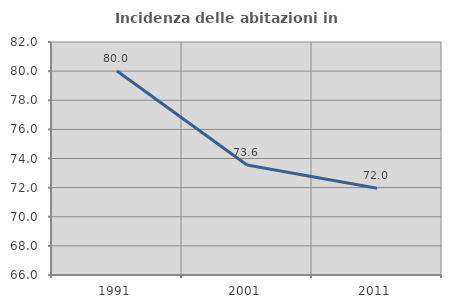
| Category | Incidenza delle abitazioni in proprietà  |
|---|---|
| 1991.0 | 80.01 |
| 2001.0 | 73.56 |
| 2011.0 | 71.957 |